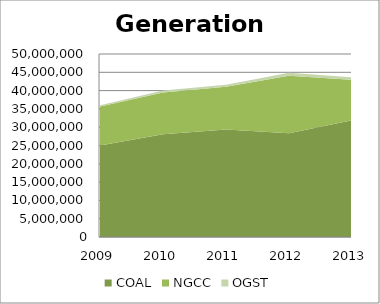
| Category | COAL | NGCC | OGST |
|---|---|---|---|
| 2009.0 | 25021209 | 10603900 | 355809 |
| 2010.0 | 28072484 | 11438365 | 507363 |
| 2011.0 | 29363619 | 11688163 | 537714 |
| 2012.0 | 28378831 | 15651184.999 | 860469.773 |
| 2013.0 | 31859866 | 11094670.997 | 704937 |